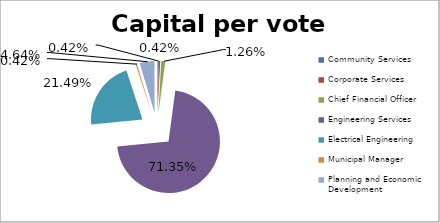
| Category | % |
|---|---|
| Community Services | 0.004 |
| Corporate Services | 0.004 |
| Chief Financial Officer | 0.013 |
| Engineering Services | 0.713 |
| Electrical Engineering | 0.215 |
| Municipal Manager | 0.004 |
| Planning and Economic Development | 0.046 |